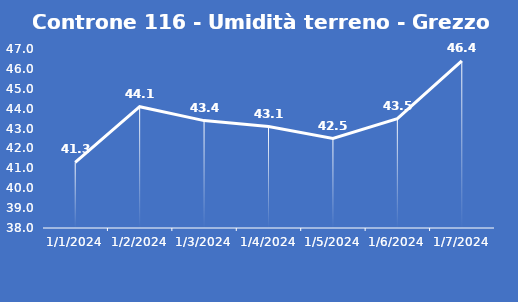
| Category | Controne 116 - Umidità terreno - Grezzo (%VWC) |
|---|---|
| 1/1/24 | 41.3 |
| 1/2/24 | 44.1 |
| 1/3/24 | 43.4 |
| 1/4/24 | 43.1 |
| 1/5/24 | 42.5 |
| 1/6/24 | 43.5 |
| 1/7/24 | 46.4 |